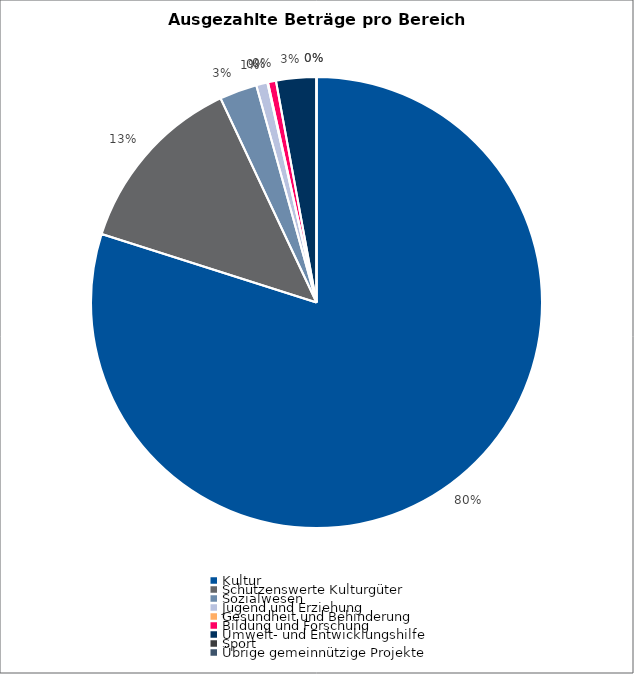
| Category | Series 0 |
|---|---|
| Kultur | 16782939.24 |
| Schützenswerte Kulturgüter | 2750557.39 |
| Sozialwesen | 564521.25 |
| Jugend und Erziehung | 168568.78 |
| Gesundheit und Behinderung | 9500 |
| Bildung und Forschung | 121000 |
| Umwelt- und Entwicklungshilfe | 605000 |
| Sport | 0 |
| Übrige gemeinnützige Projekte | 0 |